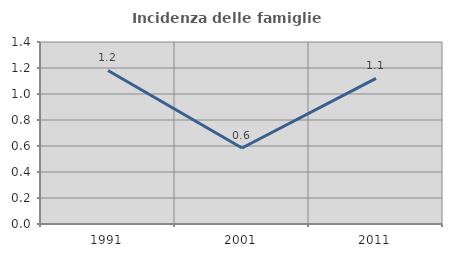
| Category | Incidenza delle famiglie numerose |
|---|---|
| 1991.0 | 1.181 |
| 2001.0 | 0.585 |
| 2011.0 | 1.12 |